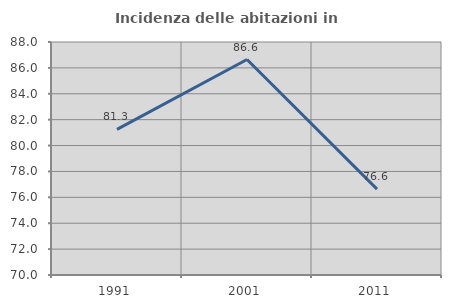
| Category | Incidenza delle abitazioni in proprietà  |
|---|---|
| 1991.0 | 81.25 |
| 2001.0 | 86.646 |
| 2011.0 | 76.636 |